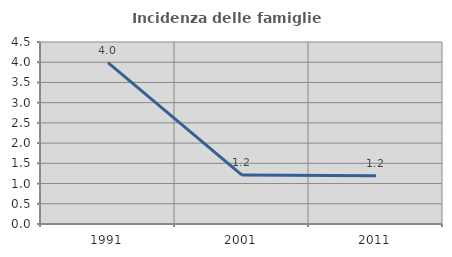
| Category | Incidenza delle famiglie numerose |
|---|---|
| 1991.0 | 3.989 |
| 2001.0 | 1.208 |
| 2011.0 | 1.194 |